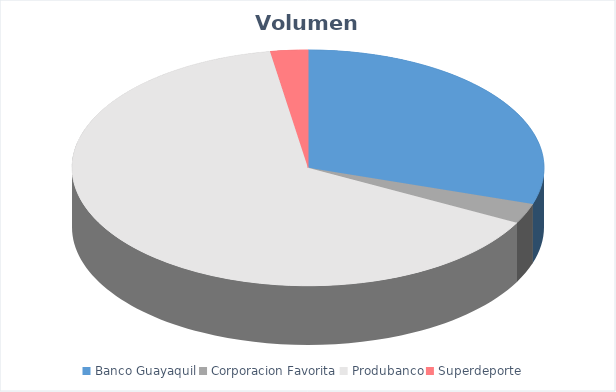
| Category | VOLUMEN ($USD) |
|---|---|
| Banco Guayaquil | 7055 |
| Corporacion Favorita | 642.3 |
| Produbanco | 15237.24 |
| Superdeporte | 605 |